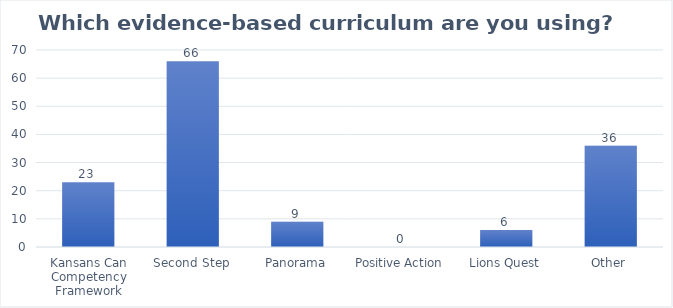
| Category | Count |
|---|---|
| Kansans Can Competency Framework | 23 |
| Second Step | 66 |
| Panorama | 9 |
| Positive Action | 0 |
| Lions Quest | 6 |
| Other | 36 |